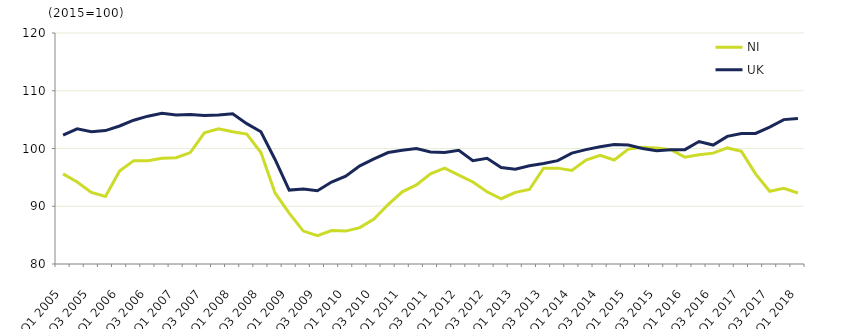
| Category | NI  | UK  |
|---|---|---|
| Q1 2005 | 95.6 | 102.3 |
|  | 94.2 | 103.4 |
| Q3 2005 | 92.4 | 102.9 |
|  | 91.7 | 103.1 |
| Q1 2006 | 96.1 | 103.9 |
|  | 97.9 | 104.9 |
| Q3 2006 | 97.9 | 105.6 |
|  | 98.3 | 106.1 |
| Q1 2007 | 98.4 | 105.8 |
|  | 99.3 | 105.9 |
| Q3 2007 | 102.7 | 105.7 |
|  | 103.4 | 105.8 |
| Q1 2008 | 102.9 | 106 |
|  | 102.5 | 104.3 |
| Q3 2008 | 99.3 | 102.9 |
|  | 92.3 | 98.1 |
| Q1 2009 | 88.8 | 92.8 |
|  | 85.7 | 93 |
| Q3 2009 | 84.9 | 92.7 |
|  | 85.8 | 94.2 |
| Q1 2010 | 85.7 | 95.2 |
|  | 86.3 | 97 |
| Q3 2010 | 87.8 | 98.2 |
|  | 90.3 | 99.3 |
| Q1 2011 | 92.5 | 99.7 |
|  | 93.7 | 100 |
| Q3 2011 | 95.6 | 99.4 |
|  | 96.6 | 99.3 |
| Q1 2012 | 95.4 | 99.7 |
|  | 94.2 | 97.9 |
| Q3 2012 | 92.5 | 98.3 |
|  | 91.3 | 96.7 |
| Q1 2013 | 92.4 | 96.4 |
|  | 92.9 | 97 |
| Q3 2013 | 96.6 | 97.4 |
|  | 96.6 | 97.9 |
| Q1 2014 | 96.2 | 99.2 |
|  | 98 | 99.8 |
| Q3 2014 | 98.8 | 100.3 |
|  | 98 | 100.7 |
| Q1 2015 | 99.9 | 100.6 |
|  | 100.2 | 100 |
| Q3 2015 | 100.1 | 99.6 |
|  | 99.8 | 99.8 |
| Q1 2016 | 98.5 | 99.8 |
|  | 98.9 | 101.2 |
| Q3 2016 | 99.2 | 100.6 |
|  | 100.1 | 102.1 |
| Q1 2017 | 99.5 | 102.6 |
|  | 95.6 | 102.6 |
| Q3 2017 | 92.6 | 103.7 |
|  | 93.1 | 105 |
| Q1 2018 | 92.3 | 105.2 |